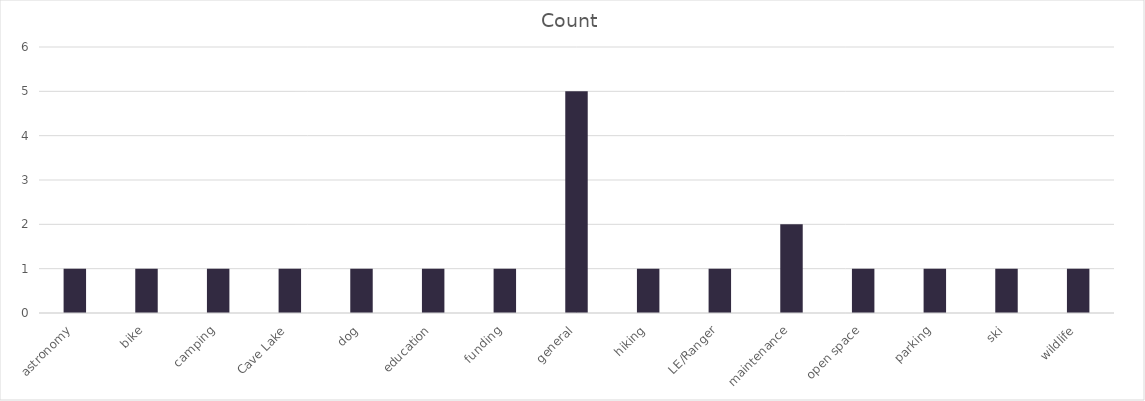
| Category | Count |
|---|---|
| astronomy | 1 |
| bike | 1 |
| camping | 1 |
| Cave Lake | 1 |
| dog | 1 |
| education | 1 |
| funding | 1 |
| general | 5 |
| hiking | 1 |
| LE/Ranger | 1 |
| maintenance | 2 |
| open space | 1 |
| parking | 1 |
| ski | 1 |
| wildlife | 1 |